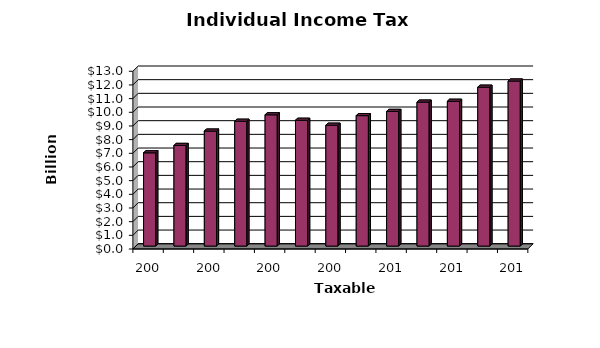
| Category | Series 0 |
|---|---|
| 2003.0 | 6.82 |
| 2004.0 | 7.36 |
| 2005.0 | 8.41 |
| 2006.0 | 9.13 |
| 2007.0 | 9.6 |
| 2008.0 | 9.2 |
| 2009.0 | 8.84 |
| 2010.0 | 9.54 |
| 2011.0 | 9.85 |
| 2012.0 | 10.53 |
| 2013.0 | 10.59 |
| 2014.0 | 11.62 |
| 2015.0 | 12.071 |